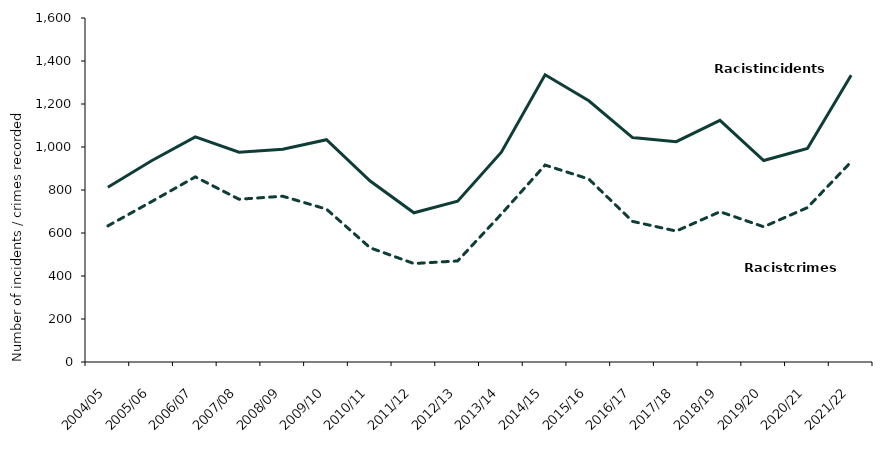
| Category | Racist incidents | Racist crimes |
|---|---|---|
| 2004/05 | 813 | 633 |
| 2005/06 | 936 | 746 |
| 2006/07 | 1047 | 861 |
| 2007/08 | 976 | 757 |
| 2008/09 | 990 | 771 |
| 2009/10 | 1034 | 711 |
| 2010/11 | 842 | 531 |
| 2011/12 | 694 | 458 |
| 2012/13 | 748 | 470 |
| 2013/14 | 976 | 688 |
| 2014/15 | 1336 | 916 |
| 2015/16 | 1215 | 851 |
| 2016/17 | 1044 | 654 |
| 2017/18 | 1025 | 609 |
| 2018/19 | 1124 | 699 |
| 2019/20 | 937 | 629 |
| 2020/21 | 993 | 718 |
| 2021/22 | 1334 | 931 |